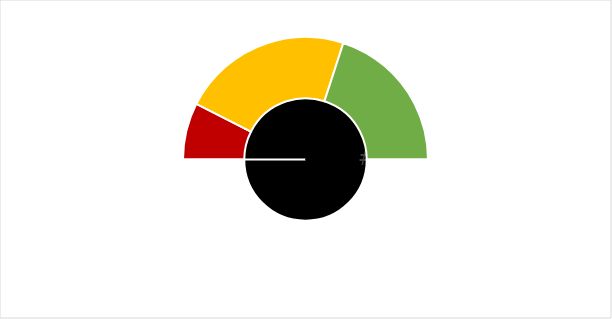
| Category | Pointer |
|---|---|
| 0 | 0 |
| 1 | 3 |
| 2 | 0 |